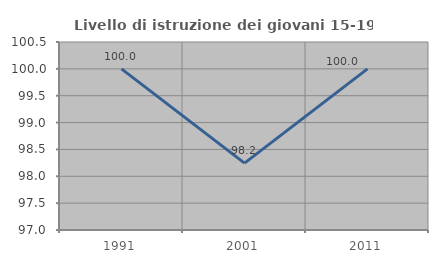
| Category | Livello di istruzione dei giovani 15-19 anni |
|---|---|
| 1991.0 | 100 |
| 2001.0 | 98.246 |
| 2011.0 | 100 |